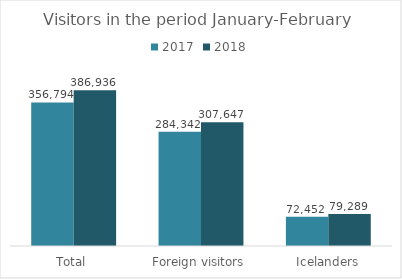
| Category | 2017 | 2018 |
|---|---|---|
| Total | 356794 | 386936 |
| Foreign visitors | 284342 | 307647 |
| Icelanders | 72452 | 79289 |